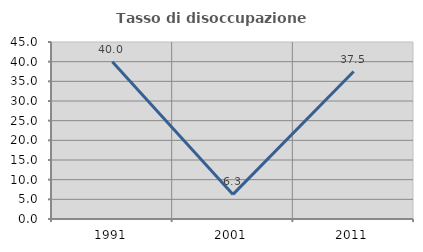
| Category | Tasso di disoccupazione giovanile  |
|---|---|
| 1991.0 | 40 |
| 2001.0 | 6.25 |
| 2011.0 | 37.5 |